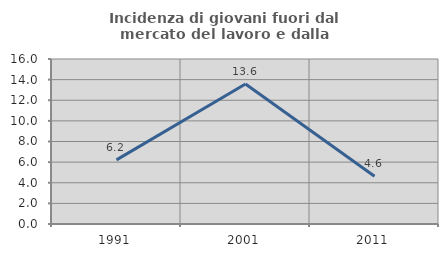
| Category | Incidenza di giovani fuori dal mercato del lavoro e dalla formazione  |
|---|---|
| 1991.0 | 6.215 |
| 2001.0 | 13.571 |
| 2011.0 | 4.63 |